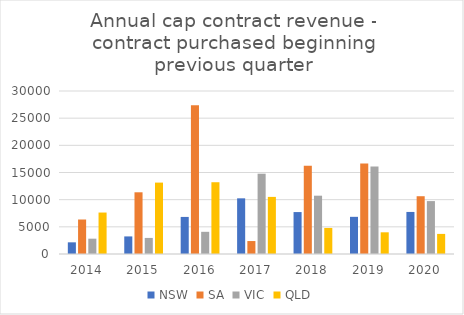
| Category | NSW | SA | VIC | QLD |
|---|---|---|---|---|
| 2014.0 | 2147.455 | 6348.96 | 2820.561 | 7630.645 |
| 2015.0 | 3236.306 | 11357.68 | 2958.146 | 13141.373 |
| 2016.0 | 6823.566 | 27398.885 | 4082.351 | 13208.59 |
| 2017.0 | 10246.343 | 2385 | 14780.096 | 10510.692 |
| 2018.0 | 7717.461 | 16260.556 | 10730.481 | 4799.485 |
| 2019.0 | 6841.042 | 16653.901 | 16125.619 | 3992.436 |
| 2020.0 | 7740.99 | 10633.199 | 9738.91 | 3699.116 |